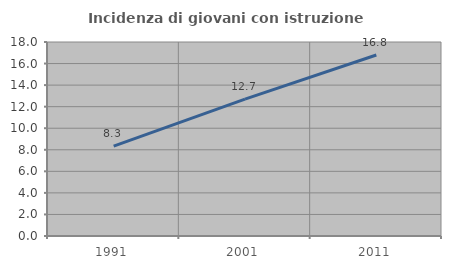
| Category | Incidenza di giovani con istruzione universitaria |
|---|---|
| 1991.0 | 8.333 |
| 2001.0 | 12.706 |
| 2011.0 | 16.796 |